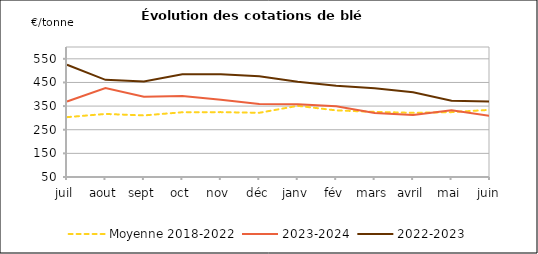
| Category | Moyenne 2018-2022 | 2023-2024 | 2022-2023 |
|---|---|---|---|
| juil | 303.17 | 369.7 | 525 |
| aout | 316.754 | 426.25 | 461 |
| sept | 310.555 | 389.75 | 454.083 |
| oct | 323.953 | 392.65 | 484.425 |
| nov | 324.475 | 376.92 | 484.513 |
| déc | 321.653 | 358.67 | 475.938 |
| janv | 351.105 | 357.4 | 452.583 |
| fév | 331.83 | 349.38 | 436.464 |
| mars | 325.621 | 320.5 | 425.983 |
| avril | 321.458 | 312.5 | 408.833 |
| mai | 324.464 | 332.5 | 372.5 |
| juin | 334.182 | 308.94 | 368.917 |